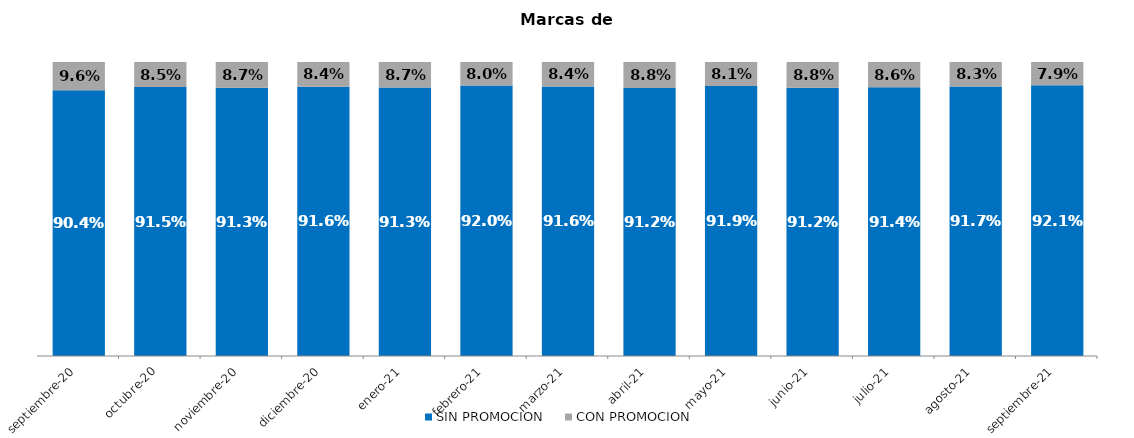
| Category | SIN PROMOCION   | CON PROMOCION   |
|---|---|---|
| 2020-09-01 | 0.904 | 0.096 |
| 2020-10-01 | 0.915 | 0.085 |
| 2020-11-01 | 0.913 | 0.087 |
| 2020-12-01 | 0.916 | 0.084 |
| 2021-01-01 | 0.913 | 0.087 |
| 2021-02-01 | 0.92 | 0.08 |
| 2021-03-01 | 0.916 | 0.084 |
| 2021-04-01 | 0.912 | 0.088 |
| 2021-05-01 | 0.919 | 0.081 |
| 2021-06-01 | 0.912 | 0.088 |
| 2021-07-01 | 0.914 | 0.086 |
| 2021-08-01 | 0.917 | 0.083 |
| 2021-09-01 | 0.921 | 0.079 |